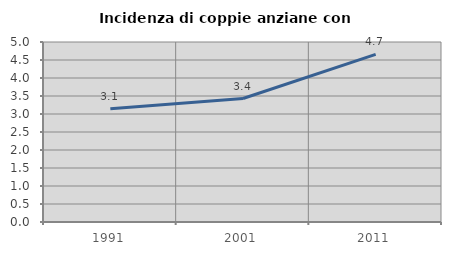
| Category | Incidenza di coppie anziane con figli |
|---|---|
| 1991.0 | 3.147 |
| 2001.0 | 3.429 |
| 2011.0 | 4.657 |